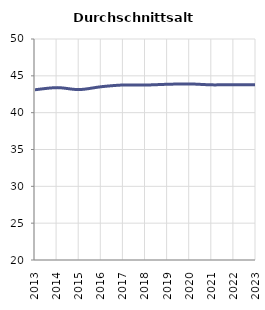
| Category | Durchschnittsalter |
|---|---|
| 2013.0 | 43.109 |
| 2014.0 | 43.4 |
| 2015.0 | 43.133 |
| 2016.0 | 43.524 |
| 2017.0 | 43.76 |
| 2018.0 | 43.751 |
| 2019.0 | 43.854 |
| 2020.0 | 43.9 |
| 2021.0 | 43.775 |
| 2022.0 | 43.8 |
| 2023.0 | 43.798 |